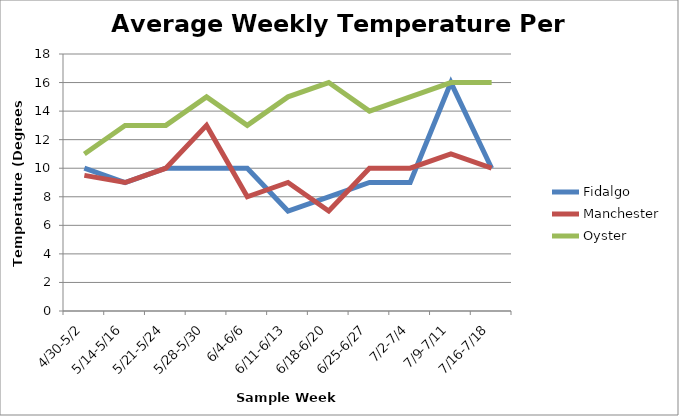
| Category | Fidalgo | Manchester | Oyster |
|---|---|---|---|
| 4/30-5/2 | 10 | 9.5 | 11 |
| 5/14-5/16 | 9 | 9 | 13 |
| 5/21-5/24 | 10 | 10 | 13 |
| 5/28-5/30 | 10 | 13 | 15 |
| 6/4-6/6 | 10 | 8 | 13 |
| 6/11-6/13 | 7 | 9 | 15 |
| 6/18-6/20 | 8 | 7 | 16 |
| 6/25-6/27 | 9 | 10 | 14 |
| 7/2-7/4 | 9 | 10 | 15 |
| 7/9-7/11 | 16 | 11 | 16 |
| 7/16-7/18 | 10 | 10 | 16 |